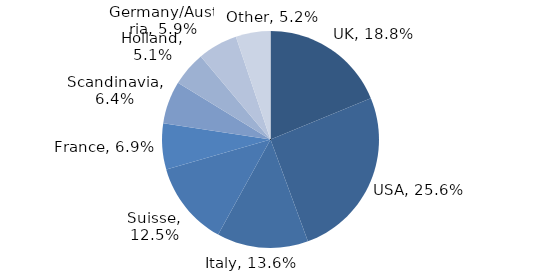
| Category | Investment Style |
|---|---|
| UK | 0.188 |
| USA | 0.256 |
| Italy | 0.136 |
| Suisse | 0.125 |
| France | 0.069 |
| Scandinavia | 0.064 |
| Holland | 0.051 |
| Germany/Austria | 0.059 |
| Other | 0.052 |